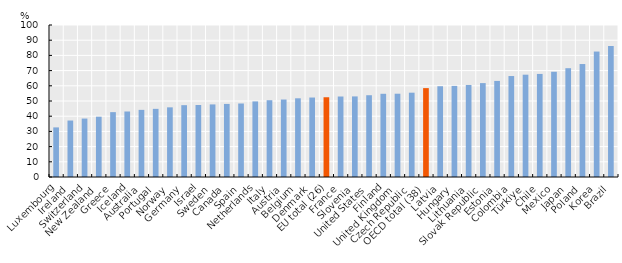
| Category | Series 3 |
|---|---|
| Luxembourg | 32.631 |
| Ireland | 37.153 |
| Switzerland | 38.44 |
| New Zealand | 39.678 |
| Greece | 42.672 |
| Iceland | 43.096 |
| Australia | 44.162 |
| Portugal | 44.834 |
| Norway | 45.826 |
| Germany | 47.259 |
| Israel | 47.371 |
| Sweden | 47.75 |
| Canada | 48.07 |
| Spain | 48.353 |
| Netherlands | 49.722 |
| Italy | 50.516 |
| Austria | 50.972 |
| Belgium | 51.778 |
| Denmark | 52.285 |
| EU total (26) | 52.466 |
| France | 52.961 |
| Slovenia | 53.02 |
| United States | 53.798 |
| Finland | 54.746 |
| United Kingdom | 54.797 |
| Czech Republic | 55.468 |
| OECD total (38) | 58.471 |
| Latvia | 59.72 |
| Hungary | 59.932 |
| Lithuania | 60.548 |
| Slovak Republic | 61.773 |
| Estonia | 63.205 |
| Colombia | 66.424 |
| Türkiye | 67.31 |
| Chile | 67.805 |
| Mexico | 69.243 |
| Japan | 71.581 |
| Poland | 74.318 |
| Korea | 82.53 |
| Brazil | 86.145 |